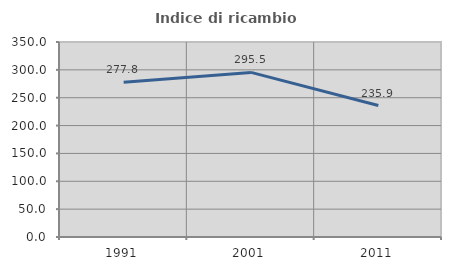
| Category | Indice di ricambio occupazionale  |
|---|---|
| 1991.0 | 277.778 |
| 2001.0 | 295.455 |
| 2011.0 | 235.897 |